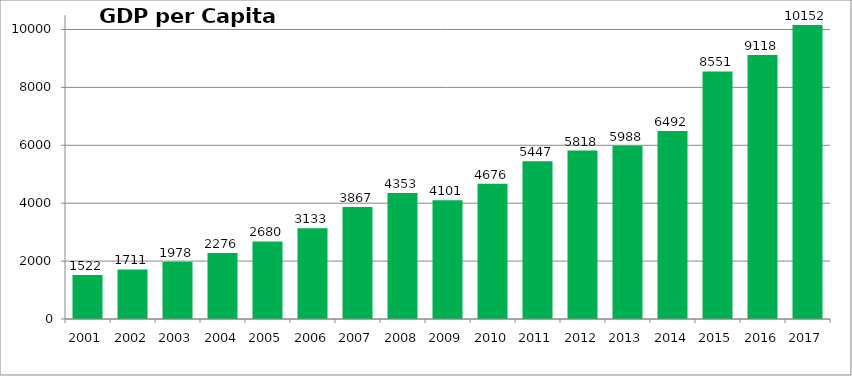
| Category | GDP per Capita (GEL) |
|---|---|
| 2001.0 | 1521.809 |
| 2002.0 | 1711.229 |
| 2003.0 | 1977.861 |
| 2004.0 | 2275.538 |
| 2005.0 | 2679.766 |
| 2006.0 | 3133.145 |
| 2007.0 | 3866.88 |
| 2008.0 | 4352.902 |
| 2009.0 | 4101.326 |
| 2010.0 | 4675.72 |
| 2011.0 | 5447.057 |
| 2012.0 | 5818.055 |
| 2013.0 | 5987.634 |
| 2014.0 | 6491.6 |
| 2015.0 | 8550.79 |
| 2016.0 | 9118 |
| 2017.0 | 10152 |